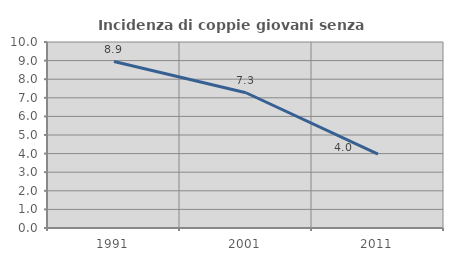
| Category | Incidenza di coppie giovani senza figli |
|---|---|
| 1991.0 | 8.948 |
| 2001.0 | 7.272 |
| 2011.0 | 3.967 |